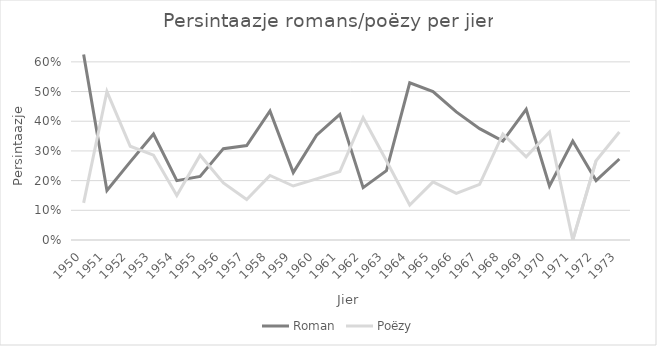
| Category | Roman | Poëzy |
|---|---|---|
| 1950.0 | 0.625 | 0.125 |
| 1951.0 | 0.167 | 0.5 |
| 1952.0 | 0.263 | 0.316 |
| 1953.0 | 0.357 | 0.286 |
| 1954.0 | 0.2 | 0.15 |
| 1955.0 | 0.214 | 0.286 |
| 1956.0 | 0.308 | 0.192 |
| 1957.0 | 0.318 | 0.136 |
| 1958.0 | 0.435 | 0.217 |
| 1959.0 | 0.227 | 0.182 |
| 1960.0 | 0.353 | 0.206 |
| 1961.0 | 0.423 | 0.231 |
| 1962.0 | 0.176 | 0.412 |
| 1963.0 | 0.233 | 0.267 |
| 1964.0 | 0.529 | 0.118 |
| 1965.0 | 0.5 | 0.196 |
| 1966.0 | 0.431 | 0.157 |
| 1967.0 | 0.375 | 0.188 |
| 1968.0 | 0.333 | 0.357 |
| 1969.0 | 0.44 | 0.28 |
| 1970.0 | 0.182 | 0.364 |
| 1971.0 | 0.333 | 0 |
| 1972.0 | 0.2 | 0.267 |
| 1973.0 | 0.273 | 0.364 |